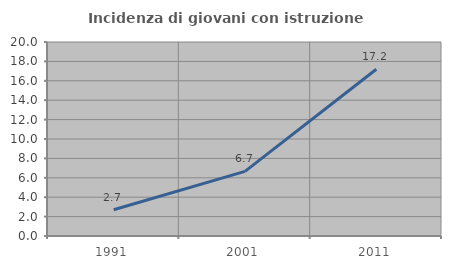
| Category | Incidenza di giovani con istruzione universitaria |
|---|---|
| 1991.0 | 2.703 |
| 2001.0 | 6.667 |
| 2011.0 | 17.188 |